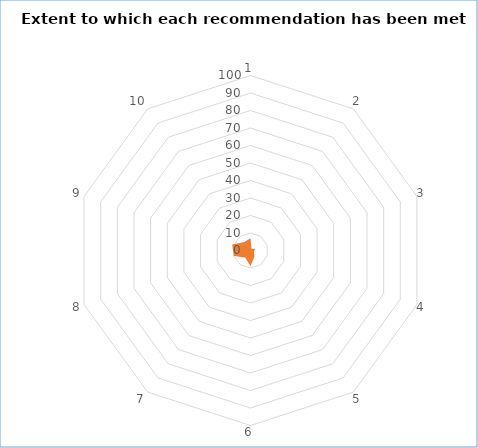
| Category | Series 1 | Series 0 |
|---|---|---|
| 0 | 7 | 0 |
| 1 | 1 | 0 |
| 2 | 3 | 0 |
| 3 | 2 | 0 |
| 4 | 4 | 0 |
| 5 | 9 | 0 |
| 6 | 5 | 0 |
| 7 | 10 | 0 |
| 8 | 11 | 0 |
| 9 | 6 | 0 |